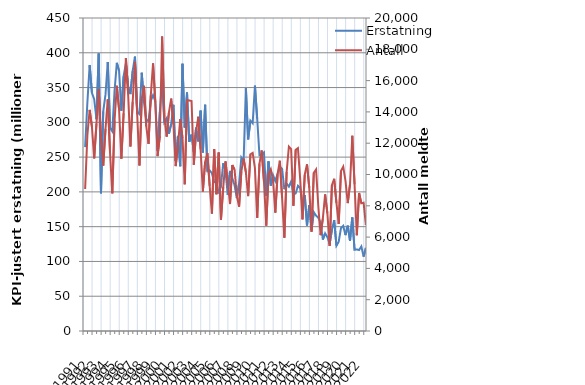
| Category | Erstatning |
|---|---|
| 1991.0 | 264.318 |
| nan | 328.859 |
| nan | 382.208 |
| nan | 342.321 |
| 1992.0 | 333.231 |
| nan | 304.48 |
| nan | 399.02 |
| nan | 197.898 |
| 1993.0 | 315.701 |
| nan | 340.156 |
| nan | 386.729 |
| nan | 292.012 |
| 1994.0 | 287.041 |
| nan | 345.625 |
| nan | 385.517 |
| nan | 374.015 |
| 1995.0 | 316.677 |
| nan | 366.337 |
| nan | 384.705 |
| nan | 352.277 |
| 1996.0 | 340.568 |
| nan | 373.865 |
| nan | 394.458 |
| nan | 315.36 |
| 1997.0 | 311.787 |
| nan | 371.356 |
| nan | 328.698 |
| nan | 303.869 |
| 1998.0 | 301.603 |
| nan | 330.854 |
| nan | 339.263 |
| nan | 330.135 |
| 1999.0 | 259.353 |
| nan | 314.699 |
| nan | 361.674 |
| nan | 299.977 |
| 2000.0 | 305.78 |
| nan | 283.576 |
| nan | 297.458 |
| nan | 325.194 |
| 2001.0 | 244.543 |
| nan | 280.481 |
| nan | 236.853 |
| nan | 384.155 |
| 2002.0 | 292.483 |
| nan | 342.902 |
| nan | 271.933 |
| nan | 282.328 |
| 2003.0 | 257.954 |
| nan | 292.294 |
| nan | 272.551 |
| nan | 316.908 |
| 2004.0 | 256.654 |
| nan | 325.356 |
| nan | 229.87 |
| nan | 230.83 |
| 2005.0 | 226.892 |
| nan | 213.842 |
| nan | 214.729 |
| nan | 197.745 |
| 2006.0 | 208.642 |
| nan | 241.28 |
| nan | 230.12 |
| nan | 195.611 |
| 2007.0 | 230.141 |
| nan | 219.845 |
| nan | 209.671 |
| nan | 190.958 |
| 2008.0 | 212.16 |
| nan | 249.458 |
| nan | 244.473 |
| nan | 349.244 |
| 2009.0 | 275.52 |
| nan | 302.386 |
| nan | 298.601 |
| nan | 352.679 |
| 2010.0 | 305.128 |
| nan | 252.646 |
| nan | 253.683 |
| nan | 256.708 |
| 2011.0 | 194.169 |
| nan | 243.911 |
| nan | 208.851 |
| nan | 224.177 |
| 2012.0 | 215.553 |
| nan | 225.942 |
| nan | 236.13 |
| nan | 233.028 |
| 2013.0 | 203.864 |
| nan | 211.897 |
| nan | 207.542 |
| nan | 215.027 |
| 2014.0 | 196.466 |
| nan | 197.723 |
| nan | 208.74 |
| nan | 205.491 |
| 2015.0 | 181.345 |
| nan | 195.388 |
| nan | 151.667 |
| nan | 180.757 |
| 2016.0 | 145.569 |
| nan | 170.846 |
| nan | 165.821 |
| nan | 162.821 |
| 2017.0 | 155.745 |
| nan | 131.451 |
| nan | 140.373 |
| nan | 134.978 |
| 2018.0 | 125.173 |
| nan | 145.275 |
| nan | 159.387 |
| nan | 122.555 |
| 2019.0 | 128.349 |
| nan | 147.888 |
| nan | 151.187 |
| nan | 137.841 |
| 2020.0 | 151.482 |
| nan | 129.649 |
| nan | 163.266 |
| nan | 116.754 |
| 2021.0 | 117.241 |
| nan | 116.41 |
| nan | 121.571 |
| nan | 106.979 |
| 2022.0 | 119.418 |